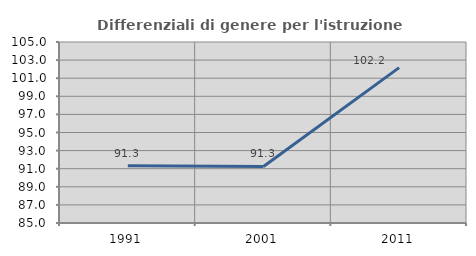
| Category | Differenziali di genere per l'istruzione superiore |
|---|---|
| 1991.0 | 91.332 |
| 2001.0 | 91.252 |
| 2011.0 | 102.17 |